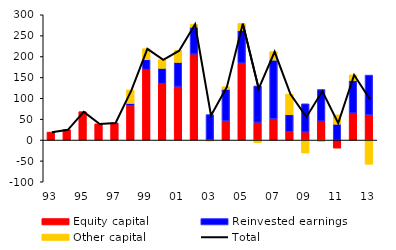
| Category | Equity capital | Reinvested earnings | Other capital |
|---|---|---|---|
| 93 | 19.1 | 0 | 0 |
| 94 | 25 | 0 | 0 |
| 95 | 68 | 0 | 0 |
| 96 | 38.8 | 0 | 0 |
| 97 | 41.3 | 0 | 0 |
| 98 | 81.9 | 5.8 | 32.3 |
| 99 | 168.7 | 23.9 | 26.2 |
| 00 | 134.9 | 36.9 | 20.6 |
| 01 | 128.2 | 57.8 | 28.6 |
| 02 | 205.7 | 64.4 | 7.6 |
| 03 | -1.5 | 60.9 | -0.1 |
| 04 | 45.7 | 75.8 | 6.3 |
| 05 | 184.3 | 78.2 | 16.7 |
| 06 | 42.4 | 87.2 | -6.2 |
| 07 | 51 | 140.5 | 20.4 |
| 08 | 19.7 | 41.2 | 49.2 |
| 09 | 19.1 | 67.7 | -31 |
| 10 | 45.1 | 75.9 | -3.8 |
| 11 | -19.2 | 38 | 22.2 |
| 12 | 64.5 | 78 | 13.8 |
| 13 | 60.3 | 95.3 | -57.9 |